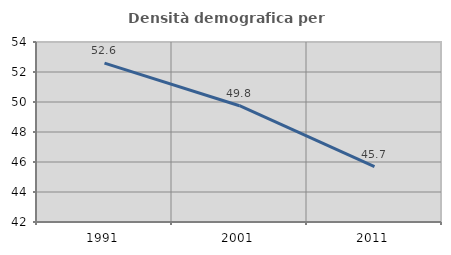
| Category | Densità demografica |
|---|---|
| 1991.0 | 52.593 |
| 2001.0 | 49.751 |
| 2011.0 | 45.699 |